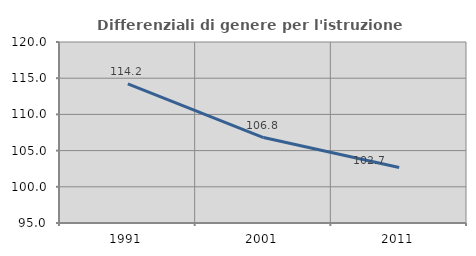
| Category | Differenziali di genere per l'istruzione superiore |
|---|---|
| 1991.0 | 114.204 |
| 2001.0 | 106.803 |
| 2011.0 | 102.67 |